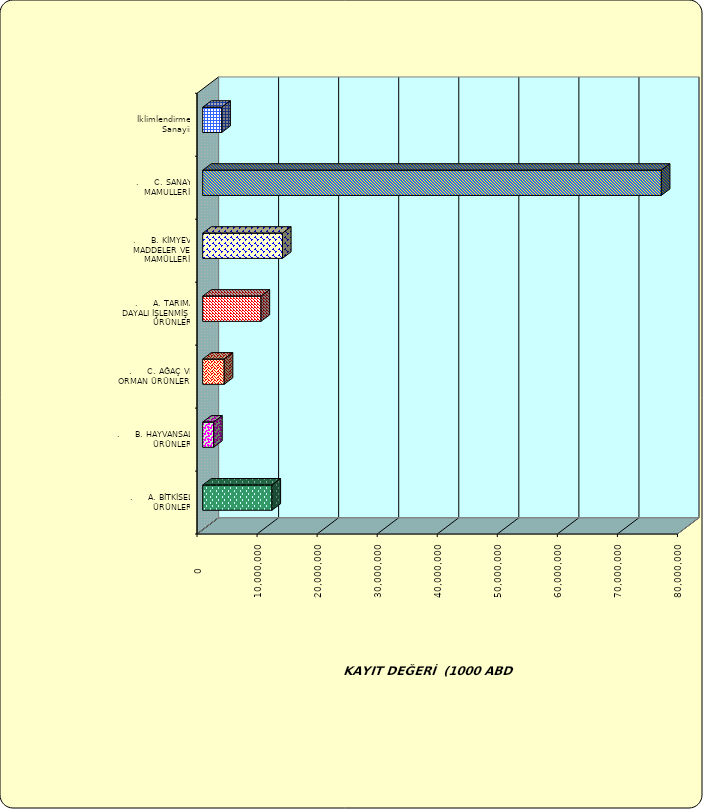
| Category | Series 0 |
|---|---|
| .     A. BİTKİSEL ÜRÜNLER | 11535940.305 |
| .     B. HAYVANSAL ÜRÜNLER | 1821130.067 |
| .     C. AĞAÇ VE ORMAN ÜRÜNLERİ | 3585450.672 |
| .     A. TARIMA DAYALI İŞLENMİŞ ÜRÜNLER | 9716979.491 |
| .     B. KİMYEVİ MADDELER VE MAMÜLLERİ | 13285402.065 |
| .     C. SANAYİ MAMULLERİ | 76365309.274 |
|  İklimlendirme Sanayii | 3178034.916 |